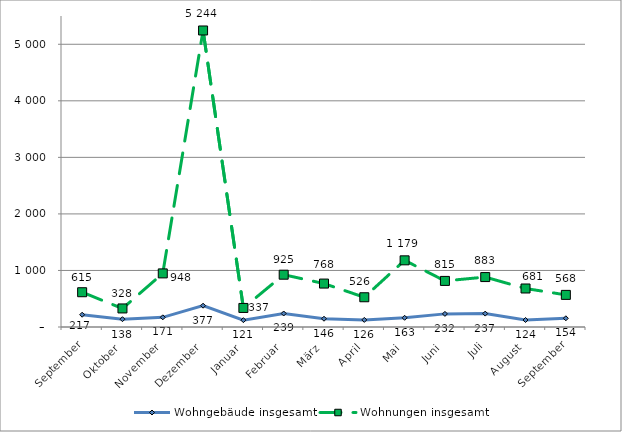
| Category | Wohngebäude insgesamt | Wohnungen insgesamt |
|---|---|---|
| September | 217 | 615 |
| Oktober | 138 | 328 |
| November | 171 | 948 |
| Dezember | 377 | 5244 |
| Januar | 121 | 337 |
| Februar | 239 | 925 |
| März | 146 | 768 |
| April | 126 | 526 |
| Mai | 163 | 1179 |
| Juni | 232 | 815 |
| Juli | 237 | 883 |
| August | 124 | 681 |
| September | 154 | 568 |